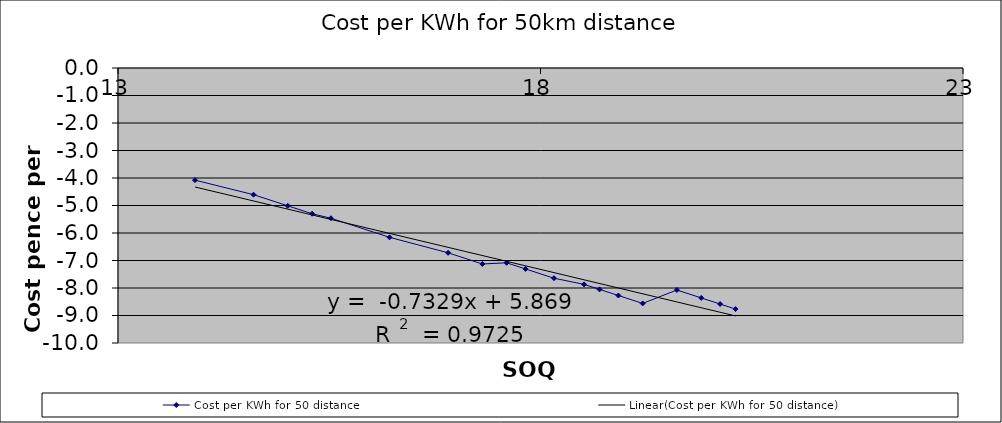
| Category | Cost per KWh for 50 distance |
|---|---|
| 20.307750392984744 | -8.766 |
| 20.125428836190792 | -8.583 |
| 19.90228528487658 | -8.36 |
| 19.6146032124248 | -8.073 |
| 19.209138104316636 | -8.561 |
| 18.921456031864853 | -8.273 |
| 18.698312480550644 | -8.05 |
| 18.51599092375669 | -7.868 |
| 18.159315979817958 | -7.644 |
| 17.822843743196746 | -7.308 |
| 17.599700191882537 | -7.085 |
| 17.312018119430753 | -7.126 |
| 16.90655301132259 | -6.721 |
| 16.213405830762646 | -6.157 |
| 15.520258650202699 | -5.464 |
| 15.29711509888849 | -5.3 |
| 15.009433026436708 | -5.012 |
| 14.603967918328545 | -4.607 |
| 13.9108207377686 | -4.078 |